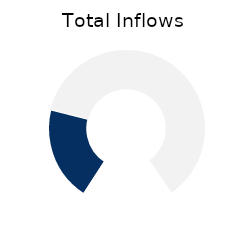
| Category | Total Inflows |
|---|---|
| 0 | 31.596 |
| 1 | 98.404 |
| 2 | 30 |